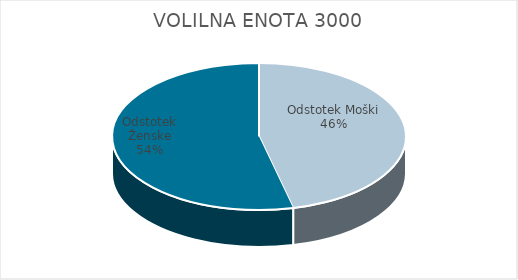
| Category | VOLILNA ENOTA 3000 | #REF! | Slovenija skupaj |
|---|---|---|---|
| Odstotek Moški | 26 |  | 25.28 |
| Odstotek Ženske | 30.19 |  | 27.73 |